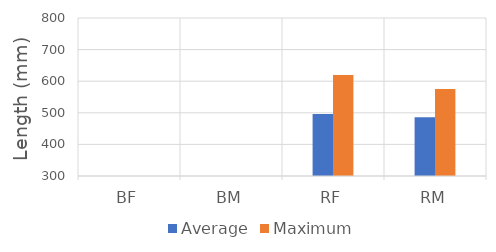
| Category | Average | Maximum |
|---|---|---|
| BF | 0 | 0 |
| BM | 0 | 0 |
| RF | 496 | 620 |
| RM | 486 | 575 |